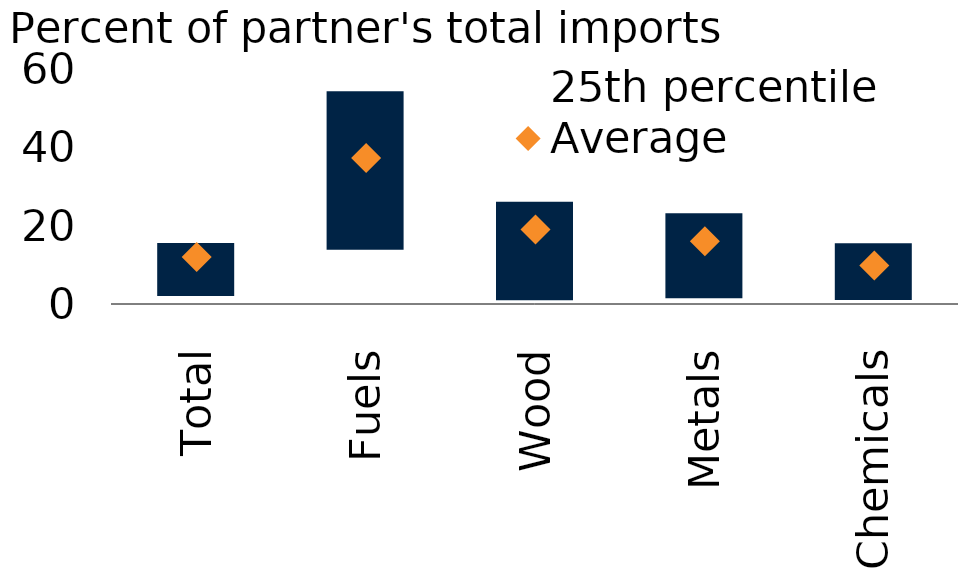
| Category | 25th percentile | Interquartile range |
|---|---|---|
| Total | 2.3 | 13.3 |
| Fuels | 14.1 | 40.2 |
| Wood | 1.2 | 24.9 |
| Metals | 1.7 | 21.5 |
| Chemicals | 1.3 | 14.2 |